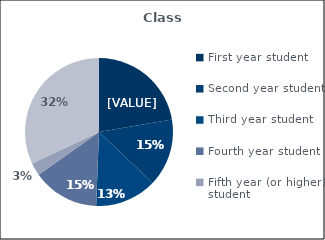
| Category | Percent |
|---|---|
| First year student | 0.223 |
| Second year student | 0.148 |
| Third year student | 0.135 |
| Fourth year student | 0.146 |
| Fifth year (or higher) student | 0.028 |
| Graduate or professional student | 0.32 |